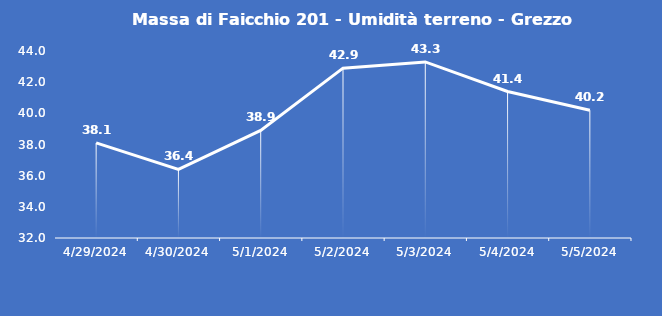
| Category | Massa di Faicchio 201 - Umidità terreno - Grezzo (%VWC) |
|---|---|
| 4/29/24 | 38.1 |
| 4/30/24 | 36.4 |
| 5/1/24 | 38.9 |
| 5/2/24 | 42.9 |
| 5/3/24 | 43.3 |
| 5/4/24 | 41.4 |
| 5/5/24 | 40.2 |